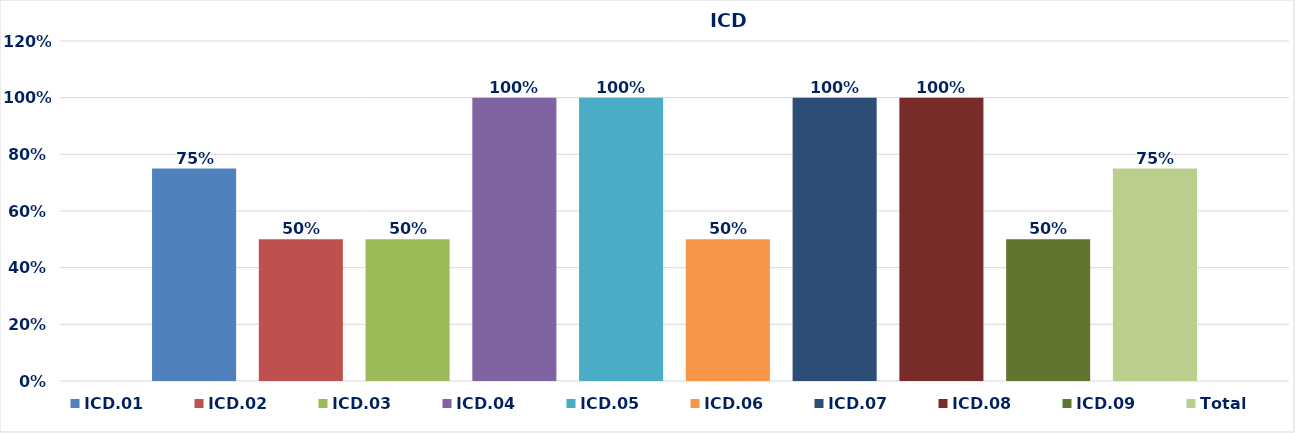
| Category | ICD.01 | ICD.02 | ICD.03 | ICD.04 | ICD.05 | ICD.06 | ICD.07 | ICD.08 | ICD.09 | Total |
|---|---|---|---|---|---|---|---|---|---|---|
| 0 | 0.75 | 0.5 | 0.5 | 1 | 1 | 0.5 | 1 | 1 | 0.5 | 0.75 |